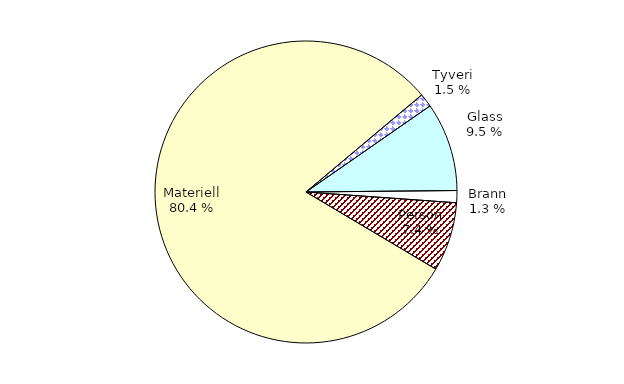
| Category | Series 0 |
|---|---|
| Tyveri | 320.69 |
| Glass | 2094.464 |
| Brann | 285.967 |
| Person | 1630.314 |
| Materiell | 17718.194 |